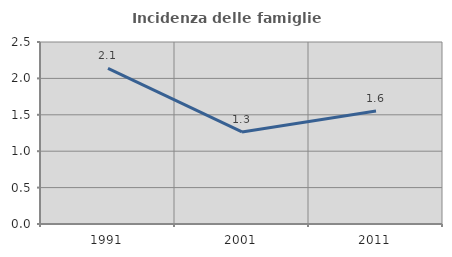
| Category | Incidenza delle famiglie numerose |
|---|---|
| 1991.0 | 2.137 |
| 2001.0 | 1.265 |
| 2011.0 | 1.551 |